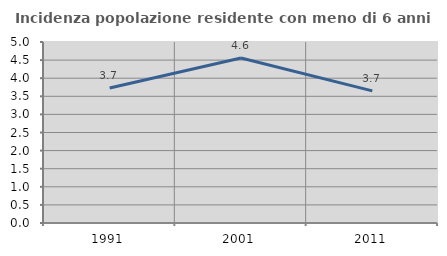
| Category | Incidenza popolazione residente con meno di 6 anni |
|---|---|
| 1991.0 | 3.727 |
| 2001.0 | 4.557 |
| 2011.0 | 3.65 |